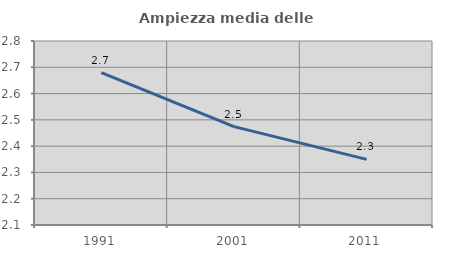
| Category | Ampiezza media delle famiglie |
|---|---|
| 1991.0 | 2.68 |
| 2001.0 | 2.474 |
| 2011.0 | 2.35 |